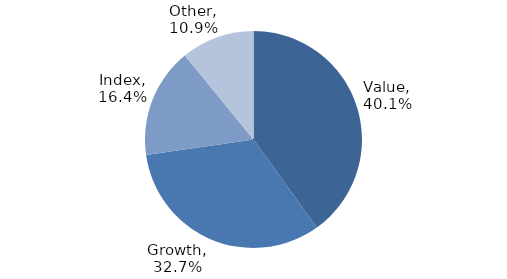
| Category | Investment Style |
|---|---|
| Value | 0.401 |
| Growth | 0.327 |
| Index | 0.164 |
| Other | 0.109 |